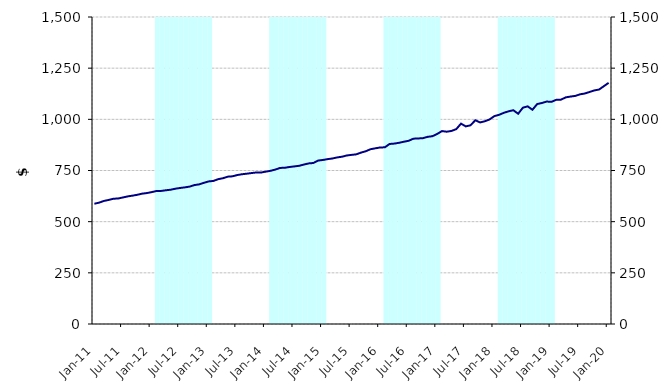
| Category | Series 1 |
|---|---|
| 0 | 0 |
| 1900-01-01 | 0 |
| 1900-01-02 | 0 |
| 1900-01-03 | 0 |
| 1900-01-04 | 0 |
| 1900-01-05 | 0 |
| 1900-01-06 | 0 |
| 1900-01-07 | 0 |
| 1900-01-08 | 0 |
| 1900-01-09 | 0 |
| 1900-01-10 | 0 |
| 1900-01-11 | 0 |
| 1900-01-12 | 0 |
| 1900-01-13 | 1500000000 |
| 1900-01-14 | 1500000000 |
| 1900-01-15 | 1500000000 |
| 1900-01-16 | 1500000000 |
| 1900-01-17 | 1500000000 |
| 1900-01-18 | 1500000000 |
| 1900-01-19 | 1500000000 |
| 1900-01-20 | 1500000000 |
| 1900-01-21 | 1500000000 |
| 1900-01-22 | 1500000000 |
| 1900-01-23 | 1500000000 |
| 1900-01-24 | 1500000000 |
| 1900-01-25 | 0 |
| 1900-01-26 | 0 |
| 1900-01-27 | 0 |
| 1900-01-28 | 0 |
| 1900-01-29 | 0 |
| 1900-01-30 | 0 |
| 1900-01-31 | 0 |
| 1900-02-01 | 0 |
| 1900-02-02 | 0 |
| 1900-02-03 | 0 |
| 1900-02-04 | 0 |
| 1900-02-05 | 0 |
| 1900-02-06 | 1500000000 |
| 1900-02-07 | 1500000000 |
| 1900-02-08 | 1500000000 |
| 1900-02-09 | 1500000000 |
| 1900-02-10 | 1500000000 |
| 1900-02-11 | 1500000000 |
| 1900-02-12 | 1500000000 |
| 1900-02-13 | 1500000000 |
| 1900-02-14 | 1500000000 |
| 1900-02-15 | 1500000000 |
| 1900-02-16 | 1500000000 |
| 1900-02-17 | 1500000000 |
| 1900-02-18 | 0 |
| 1900-02-19 | 0 |
| 1900-02-20 | 0 |
| 1900-02-21 | 0 |
| 1900-02-22 | 0 |
| 1900-02-23 | 0 |
| 1900-02-24 | 0 |
| 1900-02-25 | 0 |
| 1900-02-26 | 0 |
| 1900-02-27 | 0 |
| 1900-02-28 | 0 |
| 1900-02-28 | 0 |
| 1900-03-01 | 1500000000 |
| 1900-03-02 | 1500000000 |
| 1900-03-03 | 1500000000 |
| 1900-03-04 | 1500000000 |
| 1900-03-05 | 1500000000 |
| 1900-03-06 | 1500000000 |
| 1900-03-07 | 1500000000 |
| 1900-03-08 | 1500000000 |
| 1900-03-09 | 1500000000 |
| 1900-03-10 | 1500000000 |
| 1900-03-11 | 1500000000 |
| 1900-03-12 | 1500000000 |
| 1900-03-13 | 0 |
| 1900-03-14 | 0 |
| 1900-03-15 | 0 |
| 1900-03-16 | 0 |
| 1900-03-17 | 0 |
| 1900-03-18 | 0 |
| 1900-03-19 | 0 |
| 1900-03-20 | 0 |
| 1900-03-21 | 0 |
| 1900-03-22 | 0 |
| 1900-03-23 | 0 |
| 1900-03-24 | 0 |
| 1900-03-25 | 1500000000 |
| 1900-03-26 | 1500000000 |
| 1900-03-27 | 1500000000 |
| 1900-03-28 | 1500000000 |
| 1900-03-29 | 1500000000 |
| 1900-03-30 | 1500000000 |
| 1900-03-31 | 1500000000 |
| 1900-04-01 | 1500000000 |
| 1900-04-02 | 1500000000 |
| 1900-04-03 | 1500000000 |
| 1900-04-04 | 1500000000 |
| 1900-04-05 | 1500000000 |
| 1900-04-06 | 0 |
| 1900-04-07 | 0 |
| 1900-04-08 | 0 |
| 1900-04-09 | 0 |
| 1900-04-10 | 0 |
| 1900-04-11 | 0 |
| 1900-04-12 | 0 |
| 1900-04-13 | 0 |
| 1900-04-14 | 0 |
| 1900-04-15 | 0 |
| 1900-04-16 | 0 |
| 1900-04-17 | 0 |